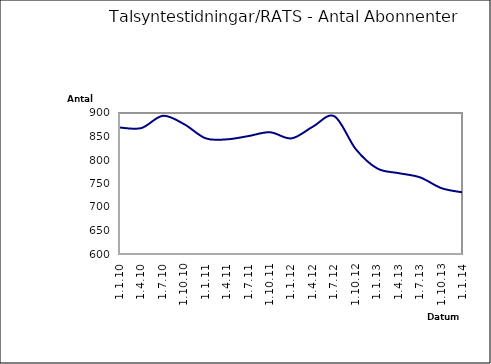
| Category | Series 0 |
|---|---|
| 1.1.10 | 869 |
| 1.4.10 | 868 |
| 1.7.10 | 894 |
| 1.10.10 | 876 |
| 1.1.11 | 846 |
| 1.4.11 | 844 |
| 1.7.11 | 851 |
| 1.10.11 | 859 |
| 1.1.12 | 846 |
| 1.4.12 | 871 |
| 1.7.12 | 893 |
| 1.10.12 | 823 |
| 1.1.13 | 782 |
| 1.4.13 | 772 |
| 1.7.13 | 763 |
| 1.10.13 | 740 |
| 1.1.14 | 731 |